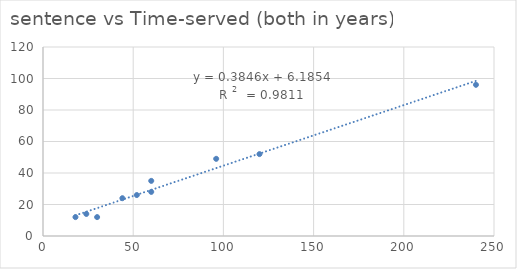
| Category | Time-served |
|---|---|
| 44.0 | 24 |
| 30.0 | 12 |
| 52.0 | 26 |
| 240.0 | 96 |
| 18.0 | 12 |
| 60.0 | 28 |
| 120.0 | 52 |
| 24.0 | 14 |
| 60.0 | 35 |
| 96.0 | 49 |